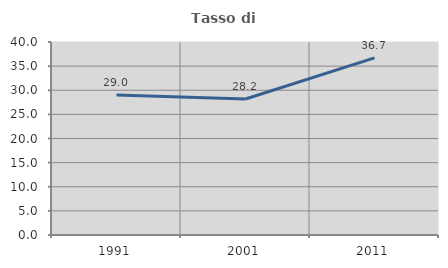
| Category | Tasso di occupazione   |
|---|---|
| 1991.0 | 29.005 |
| 2001.0 | 28.187 |
| 2011.0 | 36.724 |